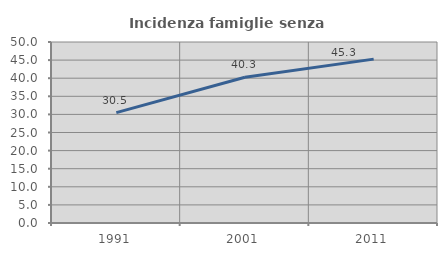
| Category | Incidenza famiglie senza nuclei |
|---|---|
| 1991.0 | 30.493 |
| 2001.0 | 40.252 |
| 2011.0 | 45.267 |